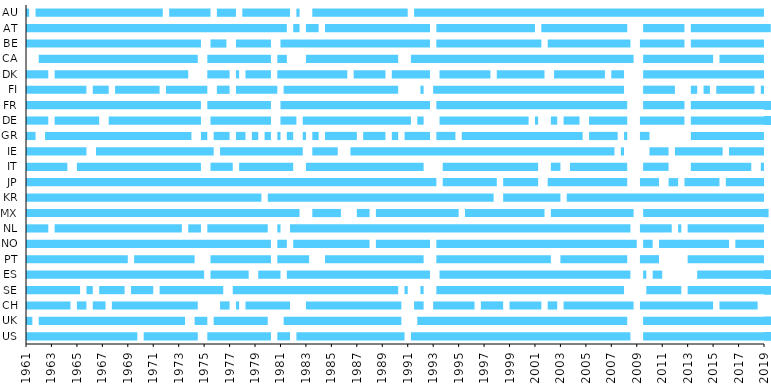
| Category | Start | 1 | 2 | 3 | 4 | 5 | 6 | 7 | 8 | 9 | 10 | 11 | 12 | 13 | 14 | 15 | 16 | 17 | 18 | 19 | 20 | 21 | 22 | 23 | 24 | 25 | 26 | 27 | 28 | 29 | 30 | 31 | 32 | 33 | 34 | 35 | 36 | 37 | 38 | 39 | 40 | 41 | 42 | 43 | 44 |
|---|---|---|---|---|---|---|---|---|---|---|---|---|---|---|---|---|---|---|---|---|---|---|---|---|---|---|---|---|---|---|---|---|---|---|---|---|---|---|---|---|---|---|---|---|---|
| US | 1961 | 0 | 8.75 | 0.5 | 4.25 | 0.75 | 5 | 0.5 | 1 | 0.5 | 8.5 | 0.5 | 17.25 | 1 | 10.5 | 0.031 | 0.531 | 0.031 | 1.078 | 0.062 | 0.656 | 0 | 0 | 0 | 0 | 0 | 0 | 0 | 0 | 0 | 0 | 0 | 0 | 0 | 0 | 0 | 0 | 0 | 0 | 0 | 0 | 0 | 0 | 0 | 0 |
| UK | 1961 | 0 | 0.5 | 0.5 | 11.5 | 0.75 | 1 | 0.5 | 4.25 | 1.25 | 9.25 | 1.25 | 16.5 | 1.25 | 10.25 | 0.078 | 0.641 | 0.031 | 1.078 | 0.062 | 0.656 | 0 | 0 | 0 | 0 | 0 | 0 | 0 | 0 | 0 | 0 | 0 | 0 | 0 | 0 | 0 | 0 | 0 | 0 | 0 | 0 | 0 | 0 | 0 | 0 |
| CH | 1961 | 0 | 3.5 | 0.5 | 0.75 | 0.5 | 1 | 0.5 | 6.75 | 1.75 | 0.75 | 0.5 | 0.25 | 0.5 | 3.5 | 1.25 | 7.5 | 1 | 0.75 | 0.75 | 3.25 | 0.5 | 1.75 | 0.5 | 2.5 | 0.5 | 0.75 | 0.5 | 5.5 | 0.5 | 5.75 | 0.5 | 3 | 0.5 | 1.25 | 0 | 0 | 0 | 0 | 0 | 0 | 0 | 0 | 0 | 0 |
| SE | 1961 | 0 | 4.25 | 0.5 | 0.5 | 0.5 | 2 | 0.5 | 1.75 | 0.5 | 5 | 0.75 | 13 | 0.5 | 0.25 | 1 | 0.25 | 1 | 14.75 | 1.75 | 2.75 | 0.5 | 7.5 | 0.031 | 0.156 | 0.031 | 0.047 | 0.031 | 0.344 | 0.031 | 0.359 | 0.031 | 0.188 | 0.031 | 0.047 | 0 | 0 | 0 | 0 | 0 | 0 | 0 | 0 | 0 | 0 |
| ES | 1961 | 0 | 14 | 0.5 | 3 | 0.75 | 1.75 | 0.5 | 11.25 | 0.75 | 15 | 1 | 0.25 | 0.5 | 0.75 | 2.75 | 6.25 | 0.062 | 0.922 | 0.109 | 0.172 | 0.031 | 0.422 | 0 | 0 | 0 | 0 | 0 | 0 | 0 | 0 | 0 | 0 | 0 | 0 | 0 | 0 | 0 | 0 | 0 | 0 | 0 | 0 | 0 | 0 |
| PT | 1961 | 0 | 8 | 0.5 | 4.75 | 1.25 | 4.75 | 0.5 | 2.5 | 1.25 | 7.75 | 1 | 9 | 0.75 | 5.25 | 1 | 1.5 | 2.25 | 7 | 0 | 0 | 0 | 0 | 0 | 0 | 0 | 0 | 0 | 0 | 0 | 0 | 0 | 0 | 0 | 0 | 0 | 0 | 0 | 0 | 0 | 0 | 0 | 0 | 0 | 0 |
| NO | 1961 | 0 | 19.25 | 0.5 | 0.75 | 0.5 | 6 | 0.5 | 4.25 | 0.5 | 15.75 | 0.5 | 0.75 | 0.5 | 5.5 | 0.5 | 3.5 | 0 | 0 | 0 | 0 | 0 | 0 | 0 | 0 | 0 | 0 | 0 | 0 | 0 | 0 | 0 | 0 | 0 | 0 | 0 | 0 | 0 | 0 | 0 | 0 | 0 | 0 | 0 | 0 |
| NL | 1961 | 0 | 1.75 | 0.5 | 10 | 0.5 | 1 | 0.5 | 4.75 | 0.75 | 0.25 | 0.75 | 26.75 | 0.75 | 2.5 | 0.5 | 0.25 | 0.5 | 7 | 0 | 0 | 0 | 0 | 0 | 0 | 0 | 0 | 0 | 0 | 0 | 0 | 0 | 0 | 0 | 0 | 0 | 0 | 0 | 0 | 0 | 0 | 0 | 0 | 0 | 0 |
| MX | 1961 | 0 | 21.5 | 1 | 2.25 | 1.25 | 1 | 0.5 | 6.5 | 0.5 | 6.25 | 0.5 | 6.5 | 0.75 | 9.75 | 0.062 | 0.016 | 0.031 | 0.438 | 0 | 0 | 0 | 0 | 0 | 0 | 0 | 0 | 0 | 0 | 0 | 0 | 0 | 0 | 0 | 0 | 0 | 0 | 0 | 0 | 0 | 0 | 0 | 0 | 0 | 0 |
| KR | 1961 | 0 | 18.5 | 0.5 | 17.75 | 0.75 | 4.5 | 0.5 | 16.5 | 0 | 0 | 0 | 0 | 0 | 0 | 0 | 0 | 0 | 0 | 0 | 0 | 0 | 0 | 0 | 0 | 0 | 0 | 0 | 0 | 0 | 0 | 0 | 0 | 0 | 0 | 0 | 0 | 0 | 0 | 0 | 0 | 0 | 0 | 0 | 0 |
| JP | 1961 | 0 | 32.25 | 0.5 | 4.25 | 0.5 | 2.75 | 0.75 | 6.25 | 1 | 1.5 | 0.75 | 0.75 | 0.5 | 2.75 | 0.5 | 3.75 | 0 | 0 | 0 | 0 | 0 | 0 | 0 | 0 | 0 | 0 | 0 | 0 | 0 | 0 | 0 | 0 | 0 | 0 | 0 | 0 | 0 | 0 | 0 | 0 | 0 | 0 | 0 | 0 |
| IT | 1961 | 0 | 3.25 | 0.75 | 9.75 | 0.75 | 1.75 | 0.5 | 4.25 | 1 | 9.25 | 1.5 | 7.5 | 1 | 0.75 | 0.75 | 4.5 | 1.25 | 2 | 1.75 | 4.75 | 0.75 | 1 | 0 | 0 | 0 | 0 | 0 | 0 | 0 | 0 | 0 | 0 | 0 | 0 | 0 | 0 | 0 | 0 | 0 | 0 | 0 | 0 | 0 | 0 |
| IE | 1961 | 0 | 4.75 | 0.75 | 9.25 | 0.5 | 6.5 | 0.75 | 2 | 1 | 20.75 | 0.5 | 0.25 | 2 | 1.5 | 0.5 | 3.75 | 0.5 | 4 | 0 | 0 | 0 | 0 | 0 | 0 | 0 | 0 | 0 | 0 | 0 | 0 | 0 | 0 | 0 | 0 | 0 | 0 | 0 | 0 | 0 | 0 | 0 | 0 | 0 | 0 |
| GR | 1961 | 0 | 0.75 | 0.75 | 11.5 | 0.75 | 0.5 | 0.5 | 1.25 | 0.5 | 0.75 | 0.5 | 0.5 | 0.5 | 0.5 | 0.5 | 0.25 | 0.5 | 0.5 | 0.75 | 0.25 | 0.5 | 0.5 | 0.5 | 2.5 | 0.5 | 1.75 | 0.5 | 0.5 | 0.5 | 2 | 0.5 | 1.5 | 0.5 | 9.5 | 0.5 | 2.25 | 0.5 | 0.25 | 1 | 0.75 | 3.25 | 6.5 | 0 | 0 |
| DE | 1961 | 0 | 1.75 | 0.5 | 3.5 | 0.75 | 7.25 | 0.75 | 4.75 | 0.75 | 1.25 | 0.5 | 8.5 | 0.5 | 0.5 | 1.25 | 7 | 0.5 | 0.25 | 1 | 0.5 | 0.5 | 1.25 | 0.75 | 3 | 1 | 3.5 | 0.5 | 6.5 | 0.031 | 0.125 | 0.031 | 0.094 | 0.031 | 0.594 | 0.031 | 0.141 | 0.031 | 0.016 | 0.062 | 0.047 | 0.172 | 0.438 | 0.008 | 0.035 |
| FR | 1961 | 0 | 13.75 | 0.5 | 5 | 0.75 | 11.75 | 0.5 | 15 | 1.25 | 3.25 | 0.5 | 6.5 | 0.031 | 0.031 | 0.062 | 0.453 | 0.031 | 0.016 | 0.062 | 0.031 | 0.031 | 0.078 | 0.047 | 0.188 | 0.062 | 0.219 | 0.031 | 0.422 | 0 | 0 | 0 | 0 | 0 | 0 | 0 | 0 | 0 | 0 | 0 | 0 | 0 | 0 | 0 | 0 |
| FI | 1961 | 0 | 4.75 | 0.5 | 1.25 | 0.5 | 3.5 | 0.5 | 3.25 | 0.75 | 1 | 0.5 | 3.25 | 0.5 | 9 | 1.75 | 0.25 | 0.75 | 15 | 1.5 | 2.5 | 1.25 | 0.5 | 0.5 | 0.5 | 0.5 | 3 | 0.5 | 1 | 0 | 0 | 0 | 0 | 0 | 0 | 0 | 0 | 0 | 0 | 0 | 0 | 0 | 0 | 0 | 0 |
| DK | 1961 | 0 | 1.75 | 0.5 | 10.5 | 1.5 | 1.75 | 0.5 | 0.25 | 0.5 | 2 | 0.5 | 5.5 | 0.5 | 2.5 | 0.5 | 3 | 0.75 | 4 | 0.5 | 3.75 | 0.75 | 4 | 0.5 | 1 | 1.5 | 10.5 | 0 | 0 | 0 | 0 | 0 | 0 | 0 | 0 | 0 | 0 | 0 | 0 | 0 | 0 | 0 | 0 | 0 | 0 |
| CA | 1961 | 1 | 12.5 | 0.75 | 5 | 0.5 | 0.75 | 1.5 | 7.25 | 1 | 17.5 | 0.75 | 5.5 | 0.5 | 4.5 | 0 | 0 | 0 | 0 | 0 | 0 | 0 | 0 | 0 | 0 | 0 | 0 | 0 | 0 | 0 | 0 | 0 | 0 | 0 | 0 | 0 | 0 | 0 | 0 | 0 | 0 | 0 | 0 | 0 | 0 |
| BE | 1961 | 0 | 13.75 | 0.75 | 1.25 | 0.75 | 2.75 | 0.75 | 11.75 | 0.5 | 8.25 | 0.5 | 6.5 | 0.75 | 3.5 | 0.5 | 6.75 | 0 | 0 | 0 | 0 | 0 | 0 | 0 | 0 | 0 | 0 | 0 | 0 | 0 | 0 | 0 | 0 | 0 | 0 | 0 | 0 | 0 | 0 | 0 | 0 | 0 | 0 | 0 | 0 |
| AT | 1961 | 0 | 20.5 | 0.5 | 0.5 | 0.5 | 1 | 0.5 | 8.25 | 0.5 | 7.75 | 0.5 | 6.75 | 1.25 | 3.25 | 0.5 | 6.25 | 0.031 | 0.344 | 0 | 0 | 0 | 0 | 0 | 0 | 0 | 0 | 0 | 0 | 0 | 0 | 0 | 0 | 0 | 0 | 0 | 0 | 0 | 0 | 0 | 0 | 0 | 0 | 0 | 0 |
| AU | 1961 | 0 | 0.25 | 0.5 | 10 | 0.5 | 3.25 | 0.5 | 1.5 | 0.5 | 3.75 | 0.5 | 0.25 | 1 | 7.5 | 0.5 | 28.75 | 0 | 0 | 0 | 0 | 0 | 0 | 0 | 0 | 0 | 0 | 0 | 0 | 0 | 0 | 0 | 0 | 0 | 0 | 0 | 0 | 0 | 0 | 0 | 0 | 0 | 0 | 0 | 0 |